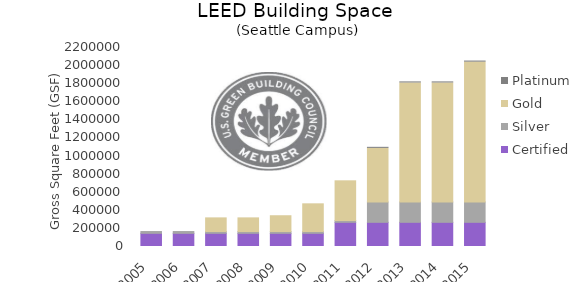
| Category | Certified | Silver | Gold | Platinum |
|---|---|---|---|---|
| 2005.0 | 145762 | 19670 | 0 | 0 |
| 2006.0 | 145762 | 19670 | 0 | 0 |
| 2007.0 | 145762 | 19670 | 150989 | 0 |
| 2008.0 | 145762 | 19670 | 150989 | 0 |
| 2009.0 | 145762 | 19670 | 174679 | 0 |
| 2010.0 | 145762 | 19670 | 306327 | 0 |
| 2011.0 | 267335 | 19670 | 439172 | 0 |
| 2012.0 | 267335 | 224915 | 592315 | 11848 |
| 2013.0 | 267335 | 224915 | 1315533 | 11848 |
| 2014.0 | 267335 | 224915 | 1315533 | 11848 |
| 2015.0 | 267335 | 224915 | 1546103 | 11848 |